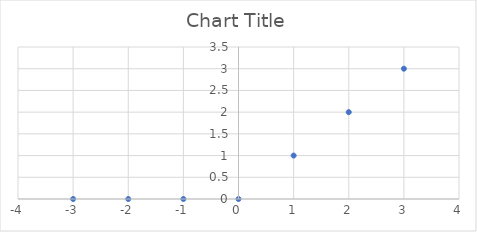
| Category | Series 0 |
|---|---|
| -3.0 | 0 |
| -2.0 | 0 |
| -1.0 | 0 |
| 0.0 | 0 |
| 1.0 | 1 |
| 2.0 | 2 |
| 3.0 | 3 |